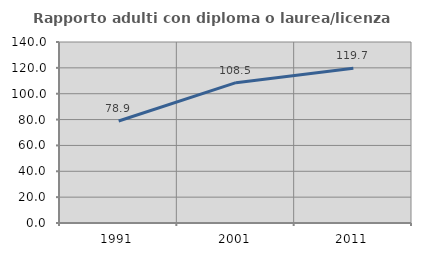
| Category | Rapporto adulti con diploma o laurea/licenza media  |
|---|---|
| 1991.0 | 78.904 |
| 2001.0 | 108.534 |
| 2011.0 | 119.685 |